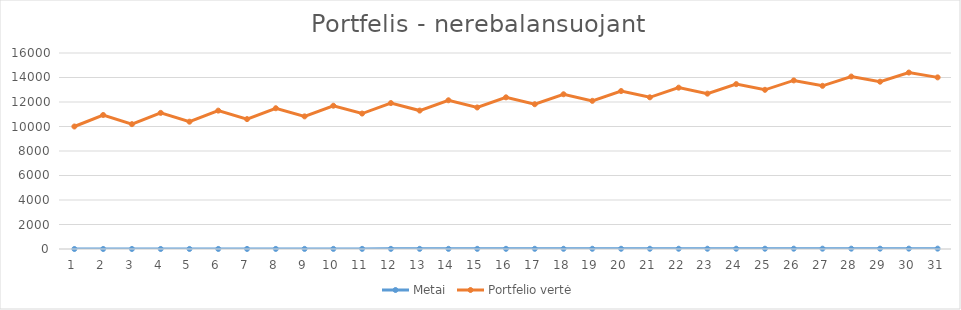
| Category | Metai | Portfelio vertė |
|---|---|---|
| 0 | 0 | 10000 |
| 1 | 1 | 10938.8 |
| 2 | 2 | 10191.537 |
| 3 | 3 | 11112.14 |
| 4 | 4 | 10392.829 |
| 5 | 5 | 11295.972 |
| 6 | 6 | 10604.093 |
| 7 | 7 | 11490.5 |
| 8 | 8 | 10825.556 |
| 9 | 9 | 11695.939 |
| 10 | 10 | 11057.454 |
| 11 | 11 | 11912.515 |
| 12 | 12 | 11300.035 |
| 13 | 13 | 12140.464 |
| 14 | 14 | 11553.554 |
| 15 | 15 | 12380.032 |
| 16 | 16 | 11818.281 |
| 17 | 17 | 12631.478 |
| 18 | 18 | 12094.494 |
| 19 | 19 | 12895.072 |
| 20 | 20 | 12382.483 |
| 21 | 21 | 13171.096 |
| 22 | 22 | 12682.549 |
| 23 | 23 | 13459.843 |
| 24 | 24 | 12995.007 |
| 25 | 25 | 13761.619 |
| 26 | 26 | 13320.181 |
| 27 | 27 | 14076.744 |
| 28 | 28 | 13658.41 |
| 29 | 29 | 14405.548 |
| 30 | 30 | 14010.044 |